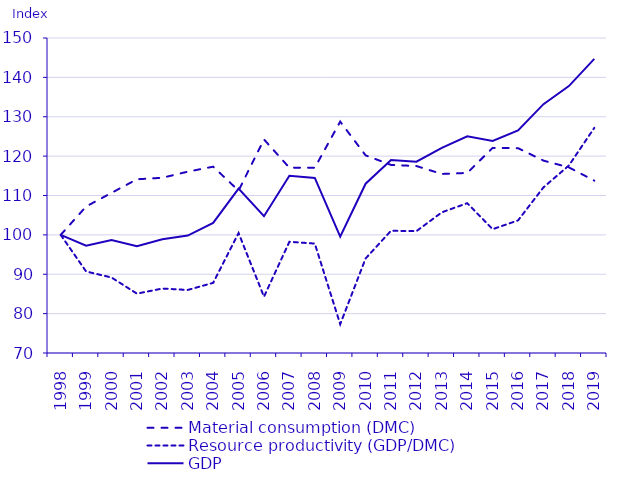
| Category | Material consumption (DMC) | Resource productivity (GDP/DMC) | GDP |
|---|---|---|---|
| 1998.0 | 100 | 100 | 100 |
| 1999.0 | 107.205 | 90.706 | 97.241 |
| 2000.0 | 110.669 | 89.173 | 98.687 |
| 2001.0 | 114.118 | 85.08 | 97.091 |
| 2002.0 | 114.502 | 86.367 | 98.892 |
| 2003.0 | 116.054 | 86.014 | 99.823 |
| 2004.0 | 117.324 | 87.813 | 103.025 |
| 2005.0 | 111.24 | 100.472 | 111.765 |
| 2006.0 | 124.243 | 84.298 | 104.734 |
| 2007.0 | 117.051 | 98.243 | 114.994 |
| 2008.0 | 117.055 | 97.792 | 114.471 |
| 2009.0 | 128.766 | 77.306 | 99.544 |
| 2010.0 | 120.194 | 94.007 | 112.991 |
| 2011.0 | 117.77 | 101.046 | 119.002 |
| 2012.0 | 117.482 | 100.944 | 118.591 |
| 2013.0 | 115.472 | 105.73 | 122.089 |
| 2014.0 | 115.735 | 108.048 | 125.049 |
| 2015.0 | 122.095 | 101.443 | 123.857 |
| 2016.0 | 122.013 | 103.682 | 126.506 |
| 2017.0 | 118.856 | 112.068 | 133.201 |
| 2018.0 | 117.143 | 117.62 | 137.784 |
| 2019.0 | 113.771 | 127.173 | 144.686 |